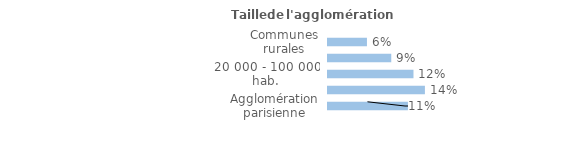
| Category | Series 0 |
|---|---|
| Communes rurales | 0.056 |
| moins de 20 000 hab. | 0.091 |
| 20 000 - 100 000 hab. | 0.123 |
| 100 000 hab. ou plus | 0.139 |
| Agglomération parisienne | 0.115 |